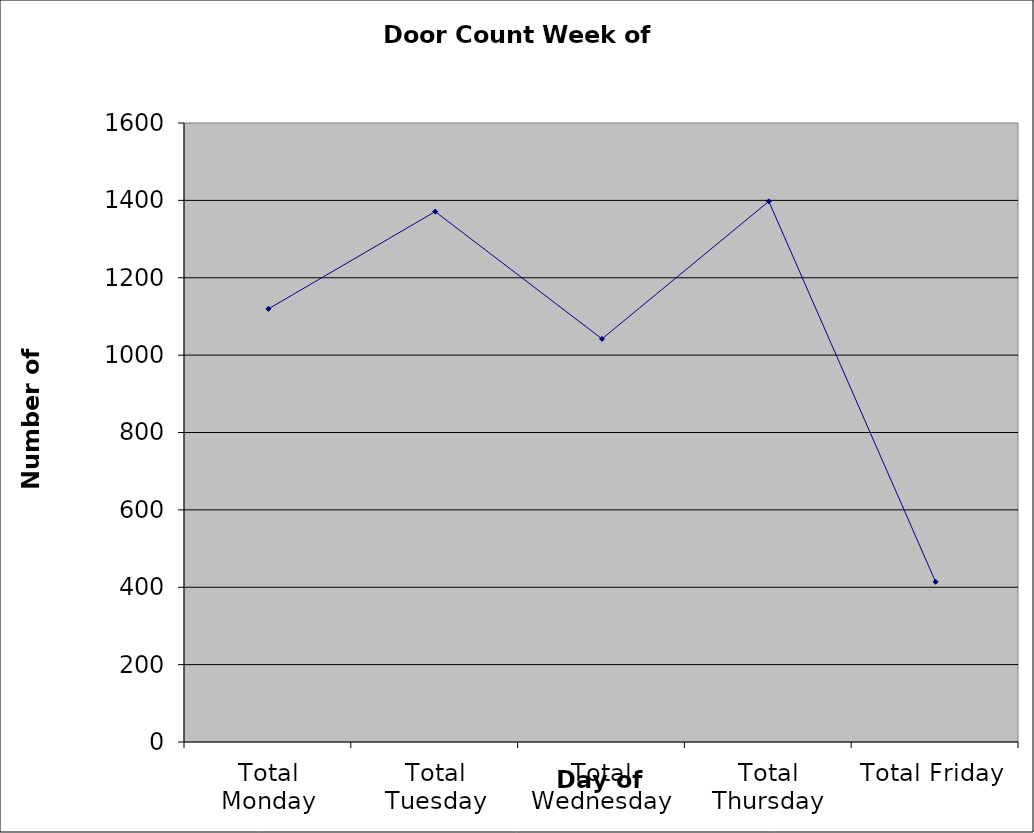
| Category | Series 0 |
|---|---|
| Total Monday | 1119.5 |
| Total Tuesday | 1371 |
| Total Wednesday | 1042 |
| Total Thursday | 1397.5 |
| Total Friday | 414 |